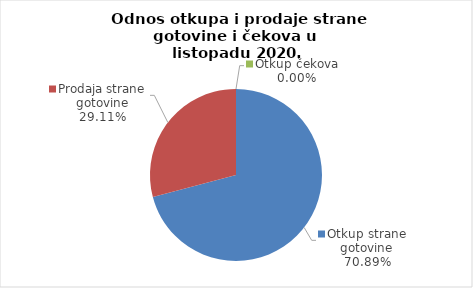
| Category | Series 0 |
|---|---|
| Otkup strane gotovine | 70.888 |
| Prodaja strane gotovine | 29.112 |
| Otkup čekova | 0 |